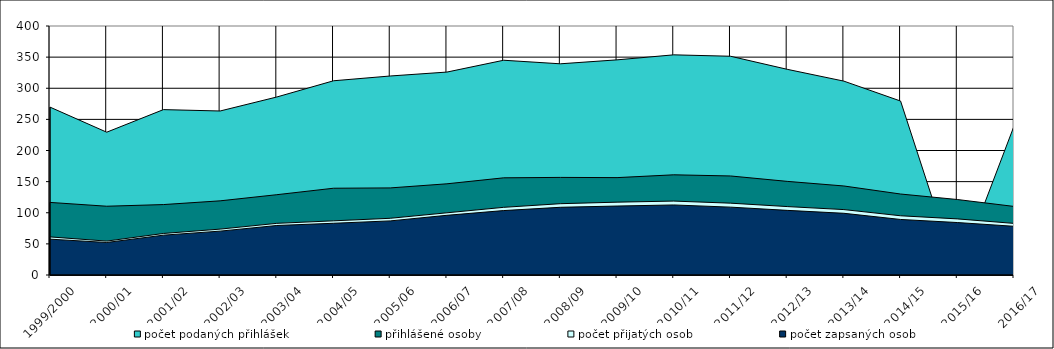
| Category | počet podaných přihlášek | přihlášené osoby | počet přijatých osob | počet zapsaných osob |
|---|---|---|---|---|
| 1999/2000 | 269.7 | 116.6 | 61.2 | 57.6 |
| 2000/01 | 229.393 | 110.486 | 54.456 | 52.248 |
| 2001/02 | 265.663 | 113.14 | 66.698 | 64.001 |
| 2002/03 | 263.476 | 119.13 | 73.7 | 70.464 |
| 2003/04 | 285.946 | 129 | 82.968 | 79.524 |
| 2004/05 | 312 | 139.4 | 87 | 83.1 |
| 2005/06 | 319.7 | 139.9 | 91.1 | 86.9 |
| 2006/07 | 326 | 146.5 | 99.9 | 95.9 |
| 2007/08 | 345 | 156.1 | 108.7 | 103.5 |
| 2008/09 | 339.262 | 156.798 | 114.539 | 108.783 |
| 2009/10 | 345.616 | 156.438 | 117.014 | 110.776 |
| 2010/11 | 353.682 | 160.953 | 118.728 | 112.52 |
| 2011/12 | 351.424 | 159.1 | 115.404 | 109.033 |
| 2012/13 | 330.443 | 150.411 | 109.919 | 103.822 |
| 2013/14 | 311.426 | 143.019 | 105.074 | 99.145 |
| 2014/15 | 279.423 | 130.09 | 95.146 | 89.229 |
| 2015/16 | 0 | 121.269 | 90.138 | 84.278 |
| 2016/17 | 239.187 | 110.163 | 82.862 | 78.257 |